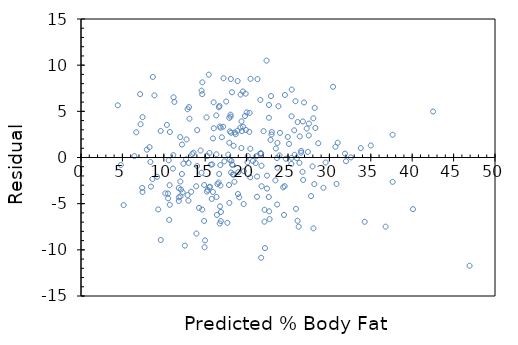
| Category | Series 0 |
|---|---|
| 15.521740493001825 | -3.222 |
| 10.521657263723291 | -4.422 |
| 18.236870183688804 | 7.063 |
| 12.188406114536587 | -1.788 |
| 25.75200609076788 | 2.948 |
| 16.34136358916864 | 4.559 |
| 17.009628360958835 | 2.19 |
| 15.569082975798054 | -3.169 |
| 7.393146997719082 | -3.293 |
| 12.368281846572305 | -0.668 |
| 9.18869674737671 | -2.089 |
| 12.017009832470627 | -4.217 |
| 17.976469123203753 | 2.824 |
| 24.422777924816454 | -3.223 |
| 21.66217192653082 | 0.438 |
| 21.79928895218358 | -0.899 |
| 20.475659311824906 | 8.524 |
| 19.564477159184644 | 3.336 |
| 15.510706764977687 | 0.489 |
| 22.16930437984174 | -5.669 |
| 22.463984696739978 | -3.364 |
| 22.15165737704541 | -6.952 |
| 8.869674491329299 | 6.73 |
| 11.179739733507478 | 6.52 |
| 7.139032565683554 | 6.861 |
| 9.324880685430688 | -5.625 |
| 8.382055216012272 | -0.482 |
| 19.920251288118944 | 2.98 |
| 7.428196018569736 | -3.728 |
| 12.87151862632674 | -4.072 |
| 14.877572675618797 | -2.978 |
| 13.937546468996754 | -8.238 |
| 7.432010030545555 | 4.368 |
| 21.168184361183627 | 0.132 |
| 31.881403796272757 | 0.419 |
| 37.63315805016781 | 2.467 |
| 23.975036431505377 | 0.225 |
| 22.70783516518881 | 5.692 |
| 46.927603428874896 | -11.728 |
| 31.005270664483135 | 1.595 |
| 40.09636613033954 | -5.596 |
| 26.939533454653258 | 5.96 |
| 32.00367308192557 | -0.404 |
| 25.90133491678558 | 6.099 |
| 10.697637322202521 | -2.998 |
| 10.368677748891098 | 3.531 |
| 7.192743338509981 | 3.607 |
| 10.720882850591586 | -5.121 |
| 16.480183466857635 | -2.88 |
| 4.809454145511477 | -0.809 |
| 16.4162903920252 | -6.216 |
| 10.505794774543872 | -3.906 |
| 14.869093225649024 | -6.869 |
| 10.18973510445415 | -3.89 |
| 10.653175763783317 | -6.753 |
| 23.712687534242082 | -1.113 |
| 25.96149564122286 | -5.561 |
| 27.396524162371573 | 0.603 |
| 28.302189450999748 | 3.198 |
| 24.73323906931343 | -0.133 |
| 25.804014011558074 | 0.296 |
| 21.310818250848452 | 8.489 |
| 26.797669329425883 | 3.902 |
| 26.381407829731614 | -0.581 |
| 28.055621381335225 | 4.244 |
| 26.160802889671835 | 3.839 |
| 14.640172158780814 | 6.86 |
| 16.836202580533943 | -3.036 |
| 8.628704947257493 | -2.329 |
| 14.555832818355675 | -1.656 |
| 19.80536504167579 | 4.495 |
| 14.253606139086461 | -5.454 |
| 12.276396143776203 | -3.776 |
| 10.734715841412083 | 2.765 |
| 15.305719329355302 | -3.506 |
| 13.039264219578207 | 5.461 |
| 7.950176211880599 | 0.85 |
| 21.756693568961968 | 0.443 |
| 24.60062415849328 | -3.101 |
| 26.291469963713745 | -7.491 |
| 24.626587288098037 | 6.773 |
| 19.88410585650818 | 6.916 |
| 22.680005860386473 | -4.28 |
| 22.695705026404564 | 4.304 |
| 27.963735678539095 | -0.964 |
| 18.0941546324433 | 8.506 |
| 17.87906655639557 | -2.979 |
| 20.32259813541205 | 2.777 |
| 12.978170407542134 | -4.678 |
| 13.585341367296266 | 0.515 |
| 22.463051609141168 | -1.963 |
| 19.67469796763388 | -1.475 |
| 11.807356958854289 | -3.307 |
| 22.04873794622516 | 2.851 |
| 14.643053083157852 | -5.643 |
| 18.98886785462802 | -1.589 |
| 16.752877989288276 | -7.153 |
| 15.785955565462682 | -4.486 |
| 18.163646232868466 | -0.364 |
| 17.909776785574945 | 4.29 |
| 18.679176474568493 | 2.521 |
| 19.37433746356223 | 1.026 |
| 16.745413288497968 | 3.355 |
| 19.434661511160854 | 2.865 |
| 25.438664021893864 | -0.039 |
| 15.9361358174985 | 2.064 |
| 26.156219113258548 | -6.856 |
| 24.521031917642755 | -6.221 |
| 13.09780375355992 | 4.202 |
| 20.450547608238264 | 0.949 |
| 18.4306605681257 | 1.269 |
| 30.859674188860602 | -2.86 |
| 21.682536530542848 | 0.417 |
| 18.588223859371162 | 2.712 |
| 19.548614670005243 | 7.151 |
| 16.35418183080966 | 0.346 |
| 16.871496586126604 | 3.229 |
| 16.611946951659682 | -2.712 |
| 17.212667959802967 | 8.587 |
| 12.871600287907405 | 5.228 |
| 21.658521237716332 | 6.241 |
| 23.719137485852933 | 1.581 |
| 12.747301503895667 | 1.953 |
| 16.82228792813278 | -0.822 |
| 13.429562589667704 | 0.37 |
| 18.292528793293478 | -0.793 |
| 18.917346755843912 | 8.283 |
| 8.67689885607184 | 8.723 |
| 18.118333248431146 | 2.682 |
| 15.675653095432796 | -0.776 |
| 17.786411089162005 | 0.314 |
| 18.058942288431304 | 4.641 |
| 23.662627450230143 | -0.063 |
| 19.27973415955042 | 6.82 |
| 15.429085025768256 | 8.971 |
| 26.58351434097695 | 0.516 |
| 14.560498256349625 | 7.24 |
| 23.844287695882787 | 5.556 |
| 16.71851707129441 | 5.581 |
| 28.07140220893396 | -7.671 |
| 20.020453117723488 | 4.88 |
| 20.440365306232245 | -2.14 |
| 19.383586677969454 | 3.916 |
| 6.67185955595923 | 2.728 |
| 10.593080368610583 | -0.293 |
| 11.989017204506947 | 2.211 |
| 21.262706003614756 | -2.063 |
| 22.9479532832425 | 6.652 |
| 8.449762302820542 | -3.15 |
| 26.749557082192183 | -1.55 |
| 8.280150534371483 | 1.12 |
| 20.100372004896712 | -0.5 |
| 4.446133654206175 | 5.654 |
| 18.126567713658908 | -1.627 |
| 23.478167941781127 | -2.478 |
| 11.277142300315663 | 6.023 |
| 27.52260746000021 | 3.677 |
| 16.88634432612656 | -6.886 |
| 9.624226440322861 | 2.876 |
| 19.251986516328763 | 3.248 |
| 11.999199506512955 | -2.599 |
| 19.645084149214615 | -5.045 |
| 17.916226737185795 | -4.916 |
| 15.849848640295118 | -0.75 |
| 26.586395265353985 | 0.714 |
| 16.034553133486142 | 3.165 |
| 18.899699753047596 | 2.9 |
| 20.142034300519548 | 0.158 |
| 34.99693249747458 | 1.303 |
| 18.332406575299398 | -1.832 |
| 12.545194992650348 | -9.545 |
| 9.631609479532507 | -8.932 |
| 17.169057827401865 | 3.331 |
| 17.317371904240105 | -0.417 |
| 28.177120902550577 | -2.877 |
| 11.103716519890781 | -1.204 |
| 14.020019634224301 | -0.92 |
| 27.514372994772444 | 2.386 |
| 18.066406989221626 | 4.434 |
| 22.725563829565807 | -5.826 |
| 25.123619100983603 | 1.476 |
| 5.152410032804742 | -5.152 |
| 15.195416859325416 | -3.695 |
| 16.367163395612042 | -4.267 |
| 18.26936492648508 | -0.769 |
| 12.068772768518802 | -3.469 |
| 27.783171843646592 | -4.183 |
| 20.767703689088112 | -0.368 |
| 21.098611099177777 | -0.599 |
| 26.831015498240287 | -2.431 |
| 11.144527389495483 | 0.255 |
| 30.441791498710778 | 7.658 |
| 18.52806313493388 | -2.628 |
| 25.398949563049293 | -0.699 |
| 14.65781916157713 | 8.142 |
| 23.009980182877342 | 2.49 |
| 16.018608982726047 | 5.981 |
| 17.94584055560506 | -0.246 |
| 6.452187703498243 | 0.148 |
| 17.5379768442999 | 6.062 |
| 15.929685865887649 | -3.73 |
| 16.648010721689783 | 5.452 |
| 26.41670183532426 | 2.283 |
| 14.977692843642675 | -8.978 |
| 33.79183979237355 | 1.008 |
| 18.44838923250269 | -1.848 |
| 22.408326087135293 | 10.492 |
| 25.44706181028297 | 7.353 |
| 13.30534546723666 | -3.705 |
| 13.912516426990791 | -3.113 |
| 11.808208384872422 | -4.708 |
| 24.9734388489478 | 2.227 |
| 17.908762036395498 | 1.591 |
| 21.81421835376422 | -3.114 |
| 15.158420001696523 | 4.342 |
| 42.51843669458384 | 4.982 |
| 12.196640579764335 | 1.403 |
| 11.814739998063935 | -4.315 |
| 23.527294938194284 | 0.973 |
| 18.956209788670385 | -3.956 |
| 22.216401877895965 | -9.816 |
| 29.282093439627737 | -3.282 |
| 16.789874846917158 | -5.29 |
| 14.92101948485854 | -9.721 |
| 21.75762665656075 | -10.858 |
| 12.694360495506704 | -0.194 |
| 19.111988566298937 | -4.312 |
| 20.36535684179502 | 4.835 |
| 16.684237814881225 | -1.784 |
| 21.25609272884256 | -4.256 |
| 17.676026957551453 | -7.076 |
| 22.775460590416415 | -6.675 |
| 15.246491692516816 | 0.154 |
| 24.03053171794872 | 2.669 |
| 23.036794738500234 | 2.763 |
| 23.686642743056645 | -5.087 |
| 22.891361586039032 | 1.909 |
| 34.26366190777568 | -6.964 |
| 12.992936485961426 | -0.593 |
| 25.432214070283013 | 4.468 |
| 14.033852625044798 | 2.966 |
| 37.63603897454487 | -2.636 |
| 27.263139487113953 | 3.137 |
| 32.59141252526646 | 0.009 |
| 29.540628324915183 | -0.541 |
| 14.443664173128198 | 0.756 |
| 28.655409301879697 | 1.545 |
| 16.901028742965174 | -5.901 |
| 28.227099324981847 | 5.373 |
| 36.787735147557584 | -7.488 |
| 26.07739663684549 | -0.077 |
| 30.734605640411427 | 1.165 |